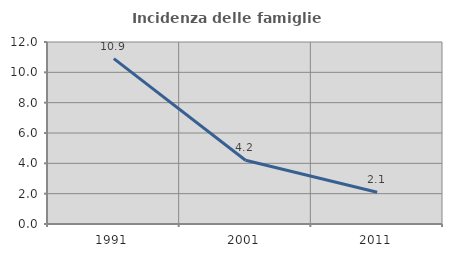
| Category | Incidenza delle famiglie numerose |
|---|---|
| 1991.0 | 10.903 |
| 2001.0 | 4.204 |
| 2011.0 | 2.096 |